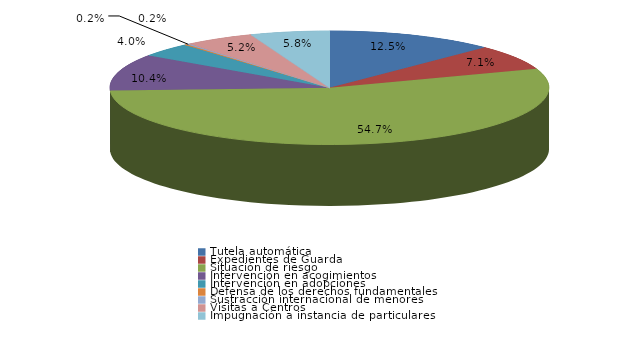
| Category | Series 0 |
|---|---|
| Tutela automática | 60 |
| Expedientes de Guarda | 34 |
| Situación de riesgo | 263 |
| Intervención en acogimientos | 50 |
| Intervención en adopciones | 19 |
| Defensa de los derechos fundamentales | 1 |
| Sustracción internacional de menores | 1 |
| Visitas a Centros | 25 |
| Ensayos Clínicos | 0 |
| Impugnación a instacia del Fiscal | 0 |
| Impugnación a instancia de particulares | 28 |